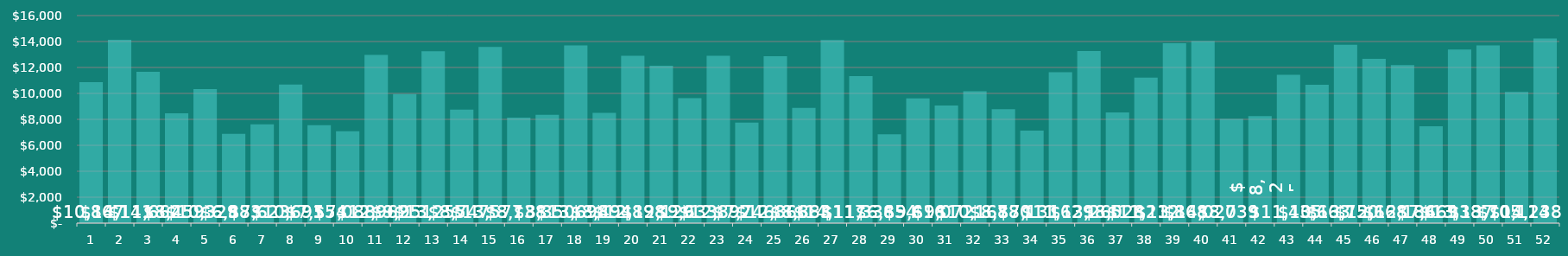
| Category | Mktg Spend |
|---|---|
| 1.0 | 10867 |
| 2.0 | 14141 |
| 3.0 | 11662 |
| 4.0 | 8459 |
| 5.0 | 10329 |
| 6.0 | 6883 |
| 7.0 | 7623 |
| 8.0 | 10691 |
| 9.0 | 7554 |
| 10.0 | 7088 |
| 11.0 | 12962 |
| 12.0 | 9951 |
| 13.0 | 13255 |
| 14.0 | 8747 |
| 15.0 | 13577 |
| 16.0 | 8138 |
| 17.0 | 8350 |
| 18.0 | 13698 |
| 19.0 | 8494 |
| 20.0 | 12898 |
| 21.0 | 12129 |
| 22.0 | 9633 |
| 23.0 | 12892 |
| 24.0 | 7746 |
| 25.0 | 12866 |
| 26.0 | 8883 |
| 27.0 | 14117 |
| 28.0 | 11336 |
| 29.0 | 6854 |
| 30.0 | 9616 |
| 31.0 | 9072 |
| 32.0 | 10168 |
| 33.0 | 8780 |
| 34.0 | 7131 |
| 35.0 | 11629 |
| 36.0 | 13260 |
| 37.0 | 8528 |
| 38.0 | 11212 |
| 39.0 | 13868 |
| 40.0 | 14027 |
| 41.0 | 8039 |
| 42.0 | 8257 |
| 43.0 | 11435 |
| 44.0 | 10663 |
| 45.0 | 13750 |
| 46.0 | 12668 |
| 47.0 | 12186 |
| 48.0 | 7469 |
| 49.0 | 13387 |
| 50.0 | 13705 |
| 51.0 | 10114 |
| 52.0 | 14238 |